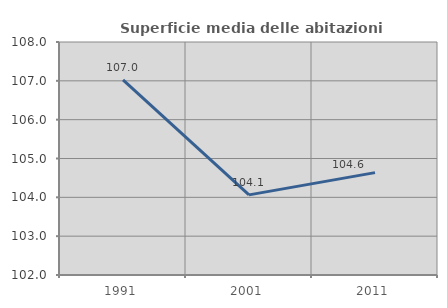
| Category | Superficie media delle abitazioni occupate |
|---|---|
| 1991.0 | 107.027 |
| 2001.0 | 104.063 |
| 2011.0 | 104.636 |